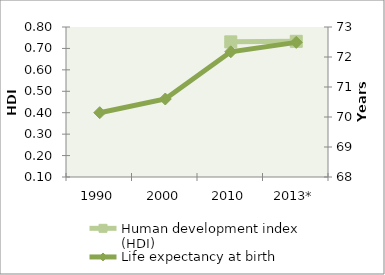
| Category | Human development index (HDI) |
|---|---|
| 1990 | 0 |
| 2000 | 0 |
| 2010 | 0.731 |
| 2013* | 0.733 |